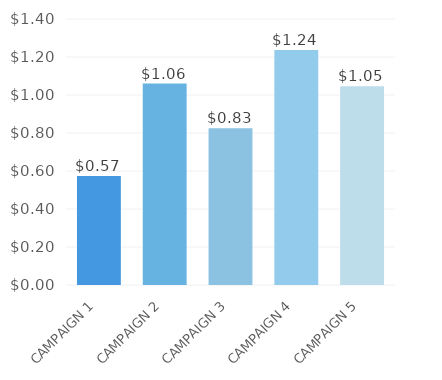
| Category | Series 0 |
|---|---|
| CAMPAIGN 1 | 0.574 |
| CAMPAIGN 2 | 1.06 |
| CAMPAIGN 3 | 0.825 |
| CAMPAIGN 4 | 1.237 |
| CAMPAIGN 5 | 1.046 |